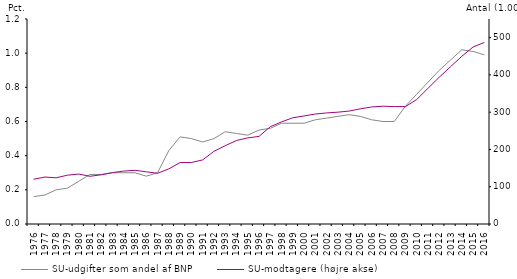
| Category | SU-udgifter som andel af BNP |
|---|---|
| 1976.0 | 0.16 |
| 1977.0 | 0.17 |
| 1978.0 | 0.2 |
| 1979.0 | 0.21 |
| 1980.0 | 0.25 |
| 1981.0 | 0.29 |
| 1982.0 | 0.29 |
| 1983.0 | 0.3 |
| 1984.0 | 0.3 |
| 1985.0 | 0.3 |
| 1986.0 | 0.28 |
| 1987.0 | 0.3 |
| 1988.0 | 0.43 |
| 1989.0 | 0.51 |
| 1990.0 | 0.5 |
| 1991.0 | 0.48 |
| 1992.0 | 0.5 |
| 1993.0 | 0.54 |
| 1994.0 | 0.53 |
| 1995.0 | 0.52 |
| 1996.0 | 0.55 |
| 1997.0 | 0.56 |
| 1998.0 | 0.59 |
| 1999.0 | 0.59 |
| 2000.0 | 0.59 |
| 2001.0 | 0.61 |
| 2002.0 | 0.62 |
| 2003.0 | 0.63 |
| 2004.0 | 0.64 |
| 2005.0 | 0.63 |
| 2006.0 | 0.61 |
| 2007.0 | 0.6 |
| 2008.0 | 0.6 |
| 2009.0 | 0.69 |
| 2010.0 | 0.76 |
| 2011.0 | 0.83 |
| 2012.0 | 0.9 |
| 2013.0 | 0.96 |
| 2014.0 | 1.02 |
| 2015.0 | 1.01 |
| 2016.0 | 0.99 |